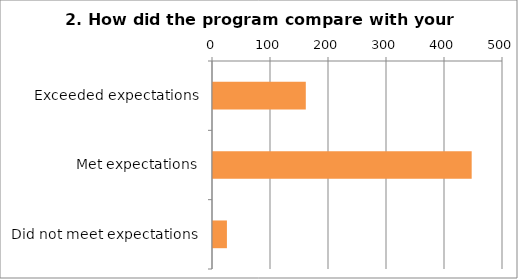
| Category | 2. How did the program compare with your expectations? |
|---|---|
| Exceeded expectations | 160 |
| Met expectations | 446 |
| Did not meet expectations | 24 |